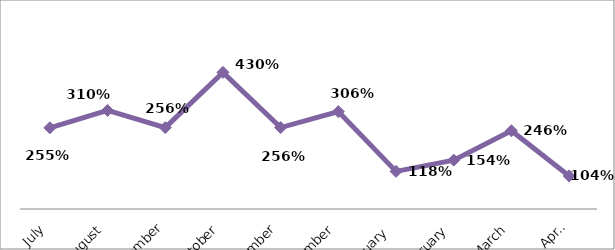
| Category | PERCENTAGE |
|---|---|
| July | 2.554 |
| August | 3.1 |
| September | 2.559 |
| October | 4.297 |
| November | 2.561 |
| December | 3.063 |
| January  | 1.184 |
| February | 1.537 |
| March | 2.46 |
| April | 1.04 |